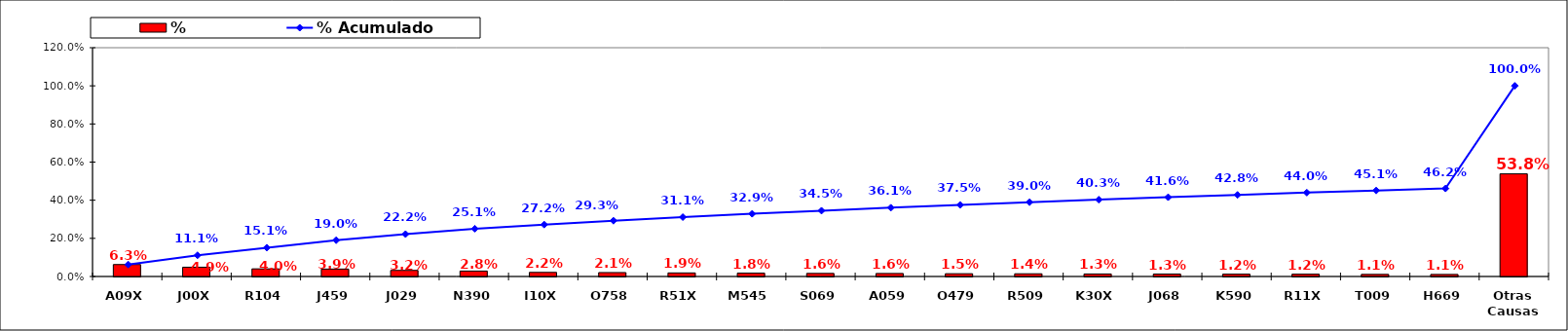
| Category | % |
|---|---|
| A09X | 0.063 |
| J00X | 0.049 |
| R104 | 0.04 |
| J459 | 0.039 |
| J029 | 0.032 |
| N390 | 0.028 |
| I10X | 0.022 |
| O758 | 0.021 |
| R51X | 0.019 |
| M545 | 0.018 |
| S069 | 0.016 |
| A059 | 0.016 |
| O479 | 0.015 |
| R509 | 0.014 |
| K30X | 0.013 |
| J068 | 0.013 |
| K590 | 0.012 |
| R11X | 0.012 |
| T009 | 0.011 |
| H669 | 0.011 |
| Otras Causas | 0.538 |